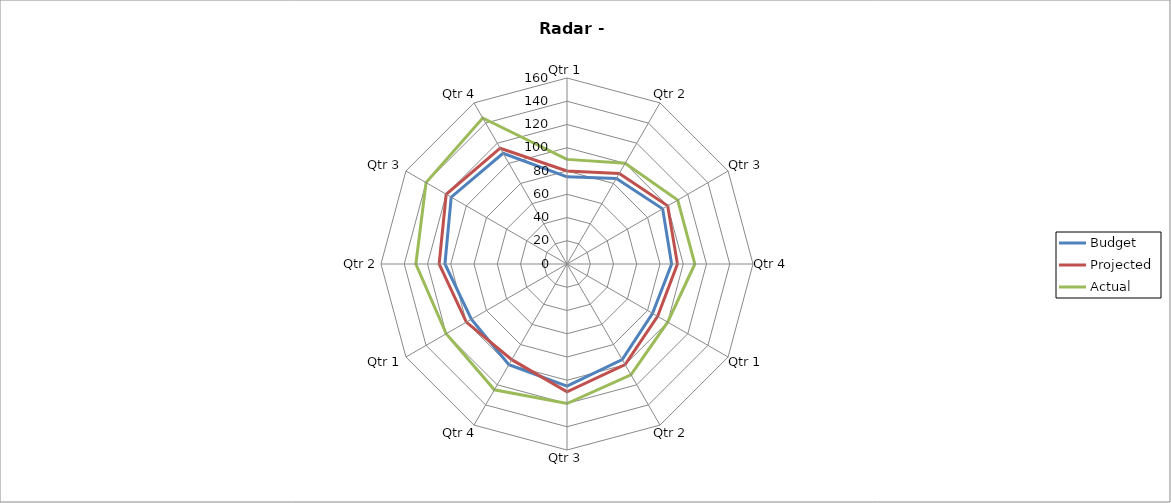
| Category | Budget | Projected | Actual |
|---|---|---|---|
| 0 | 75 | 80 | 90 |
| 1 | 85 | 90 | 100 |
| 2 | 95 | 100 | 110 |
| 3 | 90 | 95 | 110 |
| 4 | 85 | 90 | 100 |
| 5 | 95 | 100 | 110 |
| 6 | 105 | 110 | 120 |
| 7 | 100 | 95 | 125 |
| 8 | 95 | 100 | 120 |
| 9 | 105 | 110 | 130 |
| 10 | 115 | 120 | 140 |
| 11 | 110 | 115 | 145 |